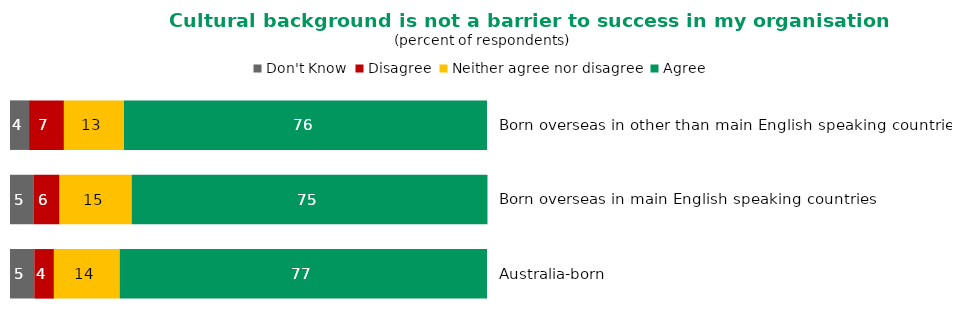
| Category | Don't Know | Disagree | Neither agree nor disagree | Agree |
|---|---|---|---|---|
| Born overseas in other than main English speaking countries | 4 | 7.3 | 12.6 | 76.1 |
| Born overseas in main English speaking countries | 4.9 | 5.5 | 15.1 | 74.6 |
| Australia-born | 5.1 | 4.1 | 13.8 | 77 |